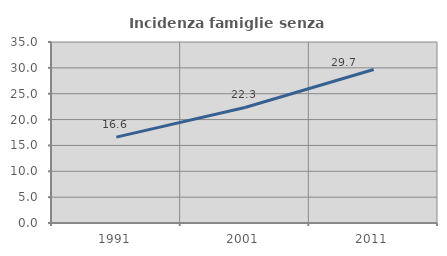
| Category | Incidenza famiglie senza nuclei |
|---|---|
| 1991.0 | 16.6 |
| 2001.0 | 22.344 |
| 2011.0 | 29.687 |